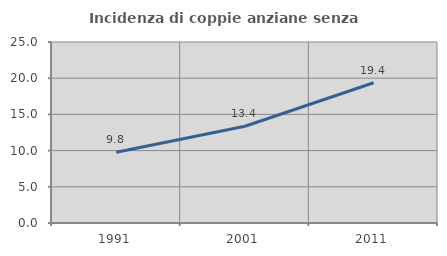
| Category | Incidenza di coppie anziane senza figli  |
|---|---|
| 1991.0 | 9.761 |
| 2001.0 | 13.363 |
| 2011.0 | 19.368 |